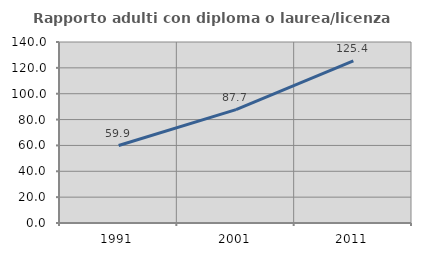
| Category | Rapporto adulti con diploma o laurea/licenza media  |
|---|---|
| 1991.0 | 59.919 |
| 2001.0 | 87.658 |
| 2011.0 | 125.407 |